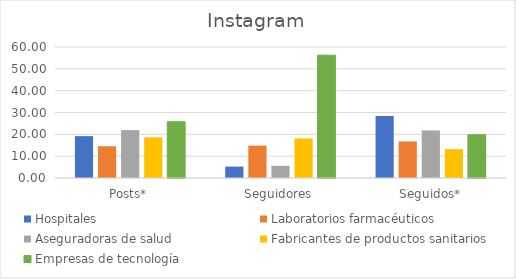
| Category | Hospitales | Laboratorios farmacéuticos | Aseguradoras de salud | Fabricantes de productos sanitarios | Empresas de tecnología |
|---|---|---|---|---|---|
| Posts* | 19.177 | 14.542 | 21.926 | 18.61 | 25.745 |
| Seguidores | 5.227 | 14.823 | 5.561 | 18.134 | 56.255 |
| Seguidos* | 28.43 | 16.733 | 21.788 | 13.235 | 19.815 |